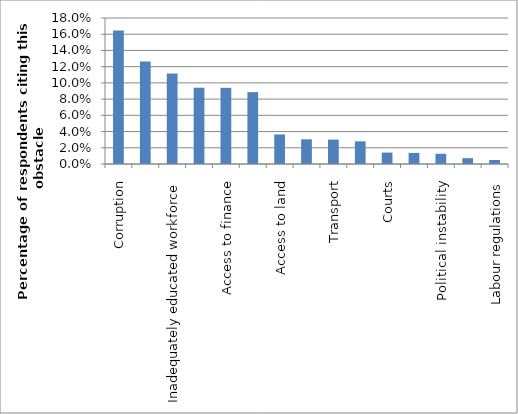
| Category | Series 0 |
|---|---|
| Corruption | 0.165 |
| Competitors in the informal sector | 0.127 |
| Inadequately educated workforce | 0.112 |
| Tax rates | 0.094 |
| Access to finance | 0.094 |
| Electricity | 0.089 |
| Access to land | 0.036 |
| Business licensing and permits | 0.03 |
| Transport | 0.03 |
| Customs and trade regulations | 0.028 |
| Courts | 0.014 |
| Crime, theft and disorder | 0.014 |
| Political instability | 0.013 |
| Tax administration | 0.007 |
| Labour regulations | 0.005 |